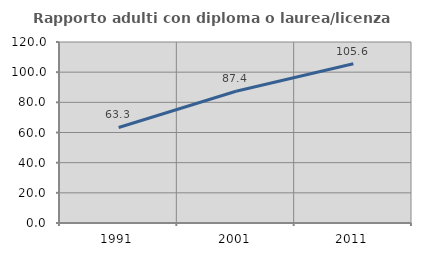
| Category | Rapporto adulti con diploma o laurea/licenza media  |
|---|---|
| 1991.0 | 63.322 |
| 2001.0 | 87.379 |
| 2011.0 | 105.6 |